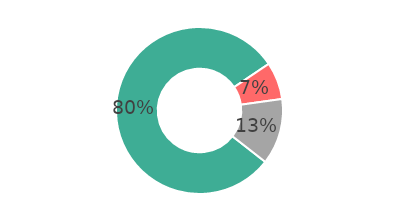
| Category | Series 0 |
|---|---|
| Oui | 80.009 |
| Non | 7.227 |
| Sans opinion | 12.764 |